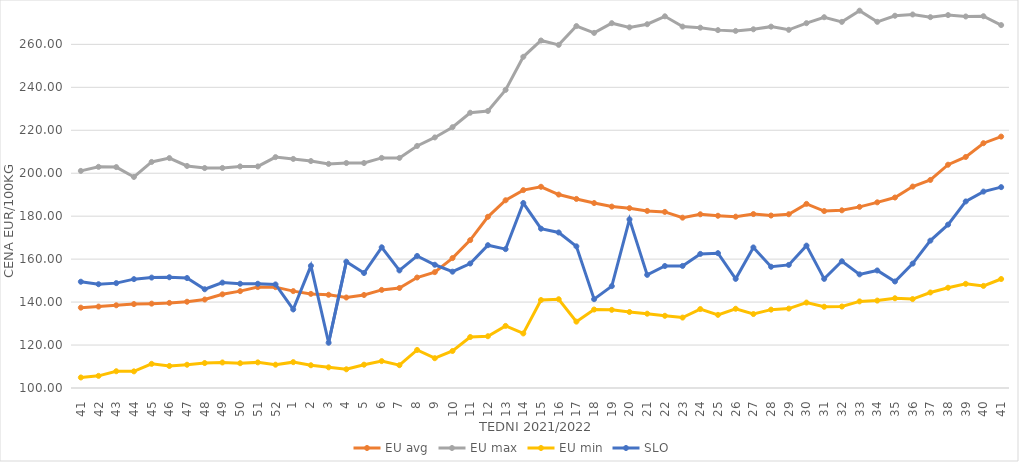
| Category | EU avg | EU max | EU min | SLO |
|---|---|---|---|---|
| 41.0 | 137.411 | 201.081 | 104.9 | 149.48 |
| 42.0 | 137.908 | 202.98 | 105.65 | 148.32 |
| 43.0 | 138.52 | 202.856 | 107.8 | 148.83 |
| 44.0 | 139.076 | 198.26 | 107.75 | 150.69 |
| 45.0 | 139.275 | 205.257 | 111.25 | 151.41 |
| 46.0 | 139.626 | 207.046 | 110.26 | 151.56 |
| 47.0 | 140.17 | 203.387 | 110.83 | 151.2 |
| 48.0 | 141.2 | 202.42 | 111.62 | 145.97 |
| 49.0 | 143.614 | 202.45 | 111.89 | 149.07 |
| 50.0 | 145.101 | 203.17 | 111.54 | 148.55 |
| 51.0 | 146.984 | 203.17 | 111.93 | 148.54 |
| 52.0 | 146.958 | 207.5 | 110.85 | 148.22 |
| 1.0 | 145.11 | 206.66 | 112.04 | 136.59 |
| 2.0 | 143.822 | 205.67 | 110.59 | 156.88 |
| 3.0 | 143.402 | 204.34 | 109.62 | 121.07 |
| 4.0 | 142.134 | 204.76 | 108.71 | 158.82 |
| 5.0 | 143.314 | 204.76 | 110.86 | 153.55 |
| 6.0 | 145.677 | 207.14 | 112.52 | 165.51 |
| 7.0 | 146.556 | 207.14 | 110.619 | 154.74 |
| 8.0 | 151.439 | 212.7 | 117.709 | 161.48 |
| 9.0 | 153.947 | 216.67 | 113.871 | 157.38 |
| 10.0 | 160.496 | 221.43 | 117.233 | 154.16 |
| 11.0 | 168.845 | 228.17 | 123.737 | 157.96 |
| 12.0 | 179.714 | 228.97 | 124.105 | 166.49 |
| 13.0 | 187.409 | 238.81 | 128.918 | 164.66 |
| 14.0 | 192.137 | 254.21 | 125.399 | 186.11 |
| 15.0 | 193.697 | 261.79 | 140.954 | 174.18 |
| 16.0 | 190.066 | 259.76 | 141.337 | 172.42 |
| 17.0 | 188.031 | 268.52 | 130.897 | 165.96 |
| 18.0 | 186.119 | 265.34 | 136.529 | 141.36 |
| 19.0 | 184.47 | 269.87 | 136.387 | 147.43 |
| 20.0 | 183.734 | 267.92 | 135.392 | 178.51 |
| 21.0 | 182.45 | 269.38 | 134.589 | 152.67 |
| 22.0 | 181.991 | 273.06 | 133.621 | 156.8 |
| 23.0 | 179.308 | 268.27 | 132.787 | 156.84 |
| 24.0 | 180.886 | 267.77 | 136.75 | 162.44 |
| 25.0 | 180.2 | 266.63 | 134.058 | 162.78 |
| 26.0 | 179.77 | 266.27 | 136.895 | 150.82 |
| 27.0 | 180.992 | 267.02 | 134.44 | 165.45 |
| 28.0 | 180.305 | 268.25 | 136.486 | 156.46 |
| 29.0 | 180.913 | 266.77 | 136.97 | 157.31 |
| 30.0 | 185.728 | 269.87 | 139.777 | 166.29 |
| 31.0 | 182.385 | 272.64 | 137.828 | 150.81 |
| 32.0 | 182.73 | 270.47 | 137.934 | 158.99 |
| 33.0 | 184.343 | 275.68 | 140.33 | 152.91 |
| 34.0 | 186.448 | 270.49 | 140.7 | 154.73 |
| 35.0 | 188.684 | 273.33 | 141.78 | 149.6 |
| 36.0 | 193.792 | 273.91 | 141.41 | 157.93 |
| 37.0 | 196.877 | 272.67 | 144.47 | 168.61 |
| 38.0 | 203.962 | 273.63 | 146.68 | 176.07 |
| 39.0 | 207.572 | 272.98 | 148.499 | 186.86 |
| 40.0 | 213.977 | 273.1 | 147.54 | 191.45 |
| 41.0 | 217.054 | 268.98 | 150.75 | 193.52 |